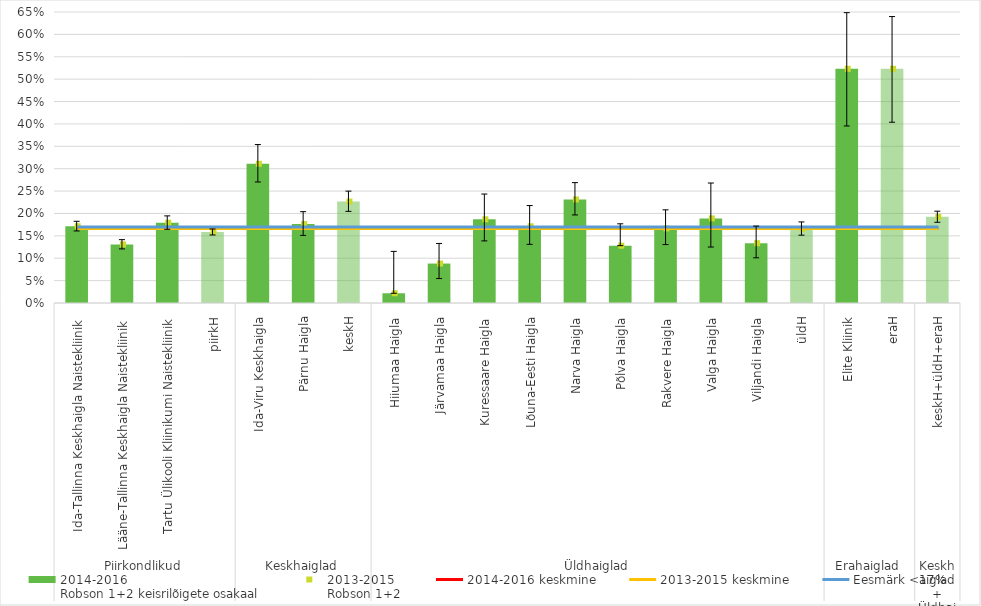
| Category | 2014-2016 
Robson 1+2 keisrilõigete osakaal |
|---|---|
| 0 | 0.171 |
| 1 | 0.131 |
| 2 | 0.179 |
| 3 | 0.158 |
| 4 | 0.311 |
| 5 | 0.176 |
| 6 | 0.227 |
| 7 | 0.022 |
| 8 | 0.088 |
| 9 | 0.187 |
| 10 | 0.171 |
| 11 | 0.231 |
| 12 | 0.128 |
| 13 | 0.167 |
| 14 | 0.189 |
| 15 | 0.134 |
| 16 | 0.166 |
| 17 | 0.523 |
| 18 | 0.523 |
| 19 | 0.192 |